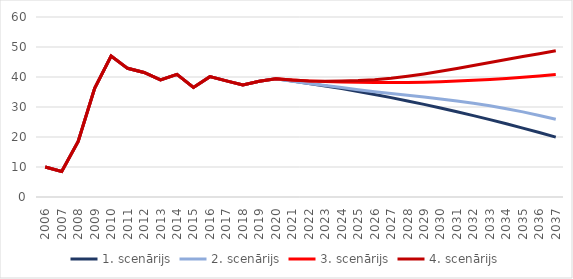
| Category | 1. scenārijs | 2. scenārijs | 3. scenārijs | 4. scenārijs |
|---|---|---|---|---|
| 2006 | 10.012 | 10.012 | 10.012 | 10.012 |
| 2007 | 8.507 | 8.507 | 8.507 | 8.507 |
| 2008 | 18.523 | 18.523 | 18.523 | 18.523 |
| 2009 | 36.251 | 36.251 | 36.251 | 36.251 |
| 2010 | 46.992 | 46.992 | 46.992 | 46.992 |
| 2011 | 42.89 | 42.89 | 42.89 | 42.89 |
| 2012 | 41.516 | 41.516 | 41.516 | 41.516 |
| 2013 | 39.027 | 39.027 | 39.027 | 39.027 |
| 2014 | 40.879 | 40.879 | 40.879 | 40.879 |
| 2015 | 36.518 | 36.518 | 36.518 | 36.518 |
| 2016 | 40.119 | 40.119 | 40.119 | 40.119 |
| 2017 | 38.716 | 38.716 | 38.716 | 38.716 |
| 2018 | 37.349 | 37.349 | 37.349 | 37.349 |
| 2019 | 38.588 | 38.588 | 38.588 | 38.588 |
| 2020 | 39.4 | 39.4 | 39.4 | 39.4 |
| 2021 | 38.651 | 38.595 | 39.026 | 38.97 |
| 2022 | 37.831 | 37.84 | 38.699 | 38.708 |
| 2023 | 37.016 | 37.144 | 38.491 | 38.622 |
| 2024 | 36.132 | 36.472 | 38.328 | 38.679 |
| 2025 | 35.184 | 35.75 | 38.21 | 38.801 |
| 2026 | 34.183 | 35.084 | 38.148 | 39.103 |
| 2027 | 33.131 | 34.47 | 38.14 | 39.585 |
| 2028 | 32.028 | 33.904 | 38.186 | 40.249 |
| 2029 | 30.875 | 33.315 | 38.285 | 41.02 |
| 2030 | 29.674 | 32.703 | 38.434 | 41.901 |
| 2031 | 28.424 | 32.016 | 38.635 | 42.832 |
| 2032 | 27.127 | 31.253 | 38.884 | 43.807 |
| 2033 | 25.784 | 30.398 | 39.182 | 44.807 |
| 2034 | 24.395 | 29.437 | 39.528 | 45.807 |
| 2035 | 22.96 | 28.369 | 39.92 | 46.8 |
| 2036 | 21.482 | 27.192 | 40.358 | 47.776 |
| 2037 | 19.959 | 25.933 | 40.841 | 48.774 |